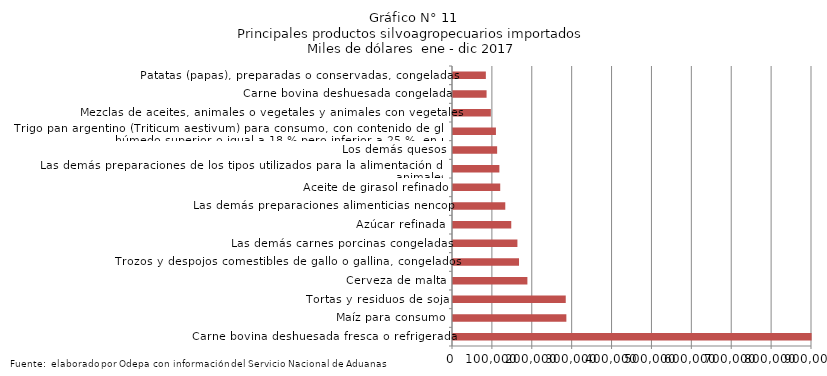
| Category | Series 0 |
|---|---|
| Carne bovina deshuesada fresca o refrigerada | 899017.258 |
| Maíz para consumo | 284204.45 |
| Tortas y residuos de soja | 282662.178 |
| Cerveza de malta | 186499.423 |
| Trozos y despojos comestibles de gallo o gallina, congelados | 165492.679 |
| Las demás carnes porcinas congeladas | 161490.368 |
| Azúcar refinada | 146065.679 |
| Las demás preparaciones alimenticias nencop | 131058.129 |
| Aceite de girasol refinado | 118396.419 |
| Las demás preparaciones de los tipos utilizados para la alimentación de los animales | 116274.059 |
| Los demás quesos | 110665.974 |
| Trigo pan argentino (Triticum aestivum) para consumo, con contenido de gluten húmedo superior o igual a 18 % pero inferior a 25 %, en peso | 107625.615 |
| Mezclas de aceites, animales o vegetales y animales con vegetales | 94913.645 |
| Carne bovina deshuesada congelada | 84161.995 |
| Patatas (papas), preparadas o conservadas, congeladas | 82348.007 |